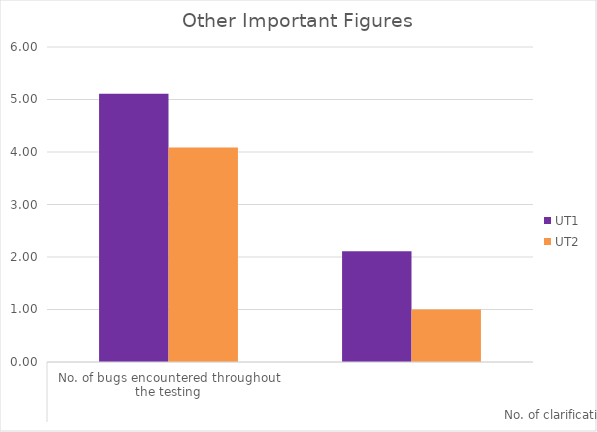
| Category | UT1 | UT2 |
|---|---|---|
| No. of clarification needed throughout the testing | 5.111 | 4.083 |
| No. of bugs encountered throughout the testing | 2.111 | 1 |